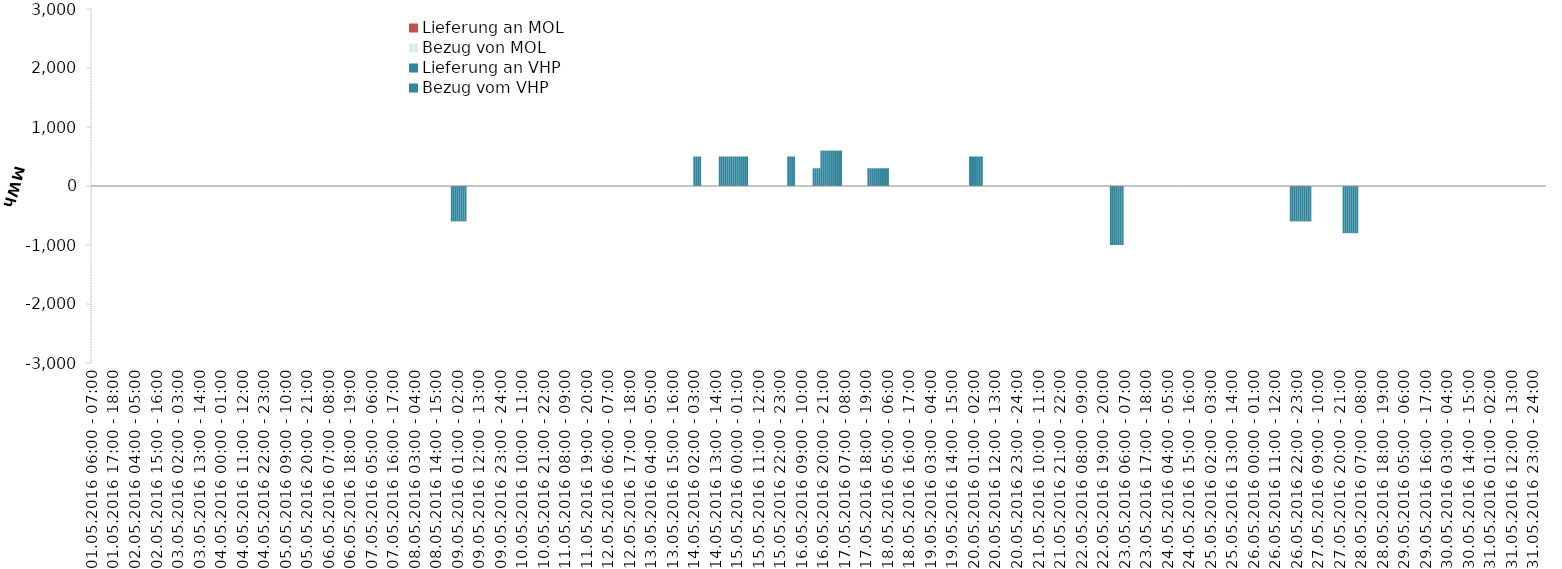
| Category | Bezug vom VHP | Lieferung an VHP | Bezug von MOL | Lieferung an MOL |
|---|---|---|---|---|
| 01.05.2016 06:00 - 07:00 | 0 | 0 | 0 | 0 |
| 01.05.2016 07:00 - 08:00 | 0 | 0 | 0 | 0 |
| 01.05.2016 08:00 - 09:00 | 0 | 0 | 0 | 0 |
| 01.05.2016 09:00 - 10:00 | 0 | 0 | 0 | 0 |
| 01.05.2016 10:00 - 11:00 | 0 | 0 | 0 | 0 |
| 01.05.2016 11:00 - 12:00 | 0 | 0 | 0 | 0 |
| 01.05.2016 12:00 - 13:00 | 0 | 0 | 0 | 0 |
| 01.05.2016 13:00 - 14:00 | 0 | 0 | 0 | 0 |
| 01.05.2016 14:00 - 15:00 | 0 | 0 | 0 | 0 |
| 01.05.2016 15:00 - 16:00 | 0 | 0 | 0 | 0 |
| 01.05.2016 16:00 - 17:00 | 0 | 0 | 0 | 0 |
| 01.05.2016 17:00 - 18:00 | 0 | 0 | 0 | 0 |
| 01.05.2016 18:00 - 19:00 | 0 | 0 | 0 | 0 |
| 01.05.2016 19:00 - 20:00 | 0 | 0 | 0 | 0 |
| 01.05.2016 20:00 - 21:00 | 0 | 0 | 0 | 0 |
| 01.05.2016 21:00 - 22:00 | 0 | 0 | 0 | 0 |
| 01.05.2016 22:00 - 23:00 | 0 | 0 | 0 | 0 |
| 01.05.2016 23:00 - 24:00 | 0 | 0 | 0 | 0 |
| 02.05.2016 00:00 - 01:00 | 0 | 0 | 0 | 0 |
| 02.05.2016 01:00 - 02:00 | 0 | 0 | 0 | 0 |
| 02.05.2016 02:00 - 03:00 | 0 | 0 | 0 | 0 |
| 02.05.2016 03:00 - 04:00 | 0 | 0 | 0 | 0 |
| 02.05.2016 04:00 - 05:00 | 0 | 0 | 0 | 0 |
| 02.05.2016 05:00 - 06:00 | 0 | 0 | 0 | 0 |
| 02.05.2016 06:00 - 07:00 | 0 | 0 | 0 | 0 |
| 02.05.2016 07:00 - 08:00 | 0 | 0 | 0 | 0 |
| 02.05.2016 08:00 - 09:00 | 0 | 0 | 0 | 0 |
| 02.05.2016 09:00 - 10:00 | 0 | 0 | 0 | 0 |
| 02.05.2016 10:00 - 11:00 | 0 | 0 | 0 | 0 |
| 02.05.2016 11:00 - 12:00 | 0 | 0 | 0 | 0 |
| 02.05.2016 12:00 - 13:00 | 0 | 0 | 0 | 0 |
| 02.05.2016 13:00 - 14:00 | 0 | 0 | 0 | 0 |
| 02.05.2016 14:00 - 15:00 | 0 | 0 | 0 | 0 |
| 02.05.2016 15:00 - 16:00 | 0 | 0 | 0 | 0 |
| 02.05.2016 16:00 - 17:00 | 0 | 0 | 0 | 0 |
| 02.05.2016 17:00 - 18:00 | 0 | 0 | 0 | 0 |
| 02.05.2016 18:00 - 19:00 | 0 | 0 | 0 | 0 |
| 02.05.2016 19:00 - 20:00 | 0 | 0 | 0 | 0 |
| 02.05.2016 20:00 - 21:00 | 0 | 0 | 0 | 0 |
| 02.05.2016 21:00 - 22:00 | 0 | 0 | 0 | 0 |
| 02.05.2016 22:00 - 23:00 | 0 | 0 | 0 | 0 |
| 02.05.2016 23:00 - 24:00 | 0 | 0 | 0 | 0 |
| 03.05.2016 00:00 - 01:00 | 0 | 0 | 0 | 0 |
| 03.05.2016 01:00 - 02:00 | 0 | 0 | 0 | 0 |
| 03.05.2016 02:00 - 03:00 | 0 | 0 | 0 | 0 |
| 03.05.2016 03:00 - 04:00 | 0 | 0 | 0 | 0 |
| 03.05.2016 04:00 - 05:00 | 0 | 0 | 0 | 0 |
| 03.05.2016 05:00 - 06:00 | 0 | 0 | 0 | 0 |
| 03.05.2016 06:00 - 07:00 | 0 | 0 | 0 | 0 |
| 03.05.2016 07:00 - 08:00 | 0 | 0 | 0 | 0 |
| 03.05.2016 08:00 - 09:00 | 0 | 0 | 0 | 0 |
| 03.05.2016 09:00 - 10:00 | 0 | 0 | 0 | 0 |
| 03.05.2016 10:00 - 11:00 | 0 | 0 | 0 | 0 |
| 03.05.2016 11:00 - 12:00 | 0 | 0 | 0 | 0 |
| 03.05.2016 12:00 - 13:00 | 0 | 0 | 0 | 0 |
| 03.05.2016 13:00 - 14:00 | 0 | 0 | 0 | 0 |
| 03.05.2016 14:00 - 15:00 | 0 | 0 | 0 | 0 |
| 03.05.2016 15:00 - 16:00 | 0 | 0 | 0 | 0 |
| 03.05.2016 16:00 - 17:00 | 0 | 0 | 0 | 0 |
| 03.05.2016 17:00 - 18:00 | 0 | 0 | 0 | 0 |
| 03.05.2016 18:00 - 19:00 | 0 | 0 | 0 | 0 |
| 03.05.2016 19:00 - 20:00 | 0 | 0 | 0 | 0 |
| 03.05.2016 20:00 - 21:00 | 0 | 0 | 0 | 0 |
| 03.05.2016 21:00 - 22:00 | 0 | 0 | 0 | 0 |
| 03.05.2016 22:00 - 23:00 | 0 | 0 | 0 | 0 |
| 03.05.2016 23:00 - 24:00 | 0 | 0 | 0 | 0 |
| 04.05.2016 00:00 - 01:00 | 0 | 0 | 0 | 0 |
| 04.05.2016 01:00 - 02:00 | 0 | 0 | 0 | 0 |
| 04.05.2016 02:00 - 03:00 | 0 | 0 | 0 | 0 |
| 04.05.2016 03:00 - 04:00 | 0 | 0 | 0 | 0 |
| 04.05.2016 04:00 - 05:00 | 0 | 0 | 0 | 0 |
| 04.05.2016 05:00 - 06:00 | 0 | 0 | 0 | 0 |
| 04.05.2016 06:00 - 07:00 | 0 | 0 | 0 | 0 |
| 04.05.2016 07:00 - 08:00 | 0 | 0 | 0 | 0 |
| 04.05.2016 08:00 - 09:00 | 0 | 0 | 0 | 0 |
| 04.05.2016 09:00 - 10:00 | 0 | 0 | 0 | 0 |
| 04.05.2016 10:00 - 11:00 | 0 | 0 | 0 | 0 |
| 04.05.2016 11:00 - 12:00 | 0 | 0 | 0 | 0 |
| 04.05.2016 12:00 - 13:00 | 0 | 0 | 0 | 0 |
| 04.05.2016 13:00 - 14:00 | 0 | 0 | 0 | 0 |
| 04.05.2016 14:00 - 15:00 | 0 | 0 | 0 | 0 |
| 04.05.2016 15:00 - 16:00 | 0 | 0 | 0 | 0 |
| 04.05.2016 16:00 - 17:00 | 0 | 0 | 0 | 0 |
| 04.05.2016 17:00 - 18:00 | 0 | 0 | 0 | 0 |
| 04.05.2016 18:00 - 19:00 | 0 | 0 | 0 | 0 |
| 04.05.2016 19:00 - 20:00 | 0 | 0 | 0 | 0 |
| 04.05.2016 20:00 - 21:00 | 0 | 0 | 0 | 0 |
| 04.05.2016 21:00 - 22:00 | 0 | 0 | 0 | 0 |
| 04.05.2016 22:00 - 23:00 | 0 | 0 | 0 | 0 |
| 04.05.2016 23:00 - 24:00 | 0 | 0 | 0 | 0 |
| 05.05.2016 00:00 - 01:00 | 0 | 0 | 0 | 0 |
| 05.05.2016 01:00 - 02:00 | 0 | 0 | 0 | 0 |
| 05.05.2016 02:00 - 03:00 | 0 | 0 | 0 | 0 |
| 05.05.2016 03:00 - 04:00 | 0 | 0 | 0 | 0 |
| 05.05.2016 04:00 - 05:00 | 0 | 0 | 0 | 0 |
| 05.05.2016 05:00 - 06:00 | 0 | 0 | 0 | 0 |
| 05.05.2016 06:00 - 07:00 | 0 | 0 | 0 | 0 |
| 05.05.2016 07:00 - 08:00 | 0 | 0 | 0 | 0 |
| 05.05.2016 08:00 - 09:00 | 0 | 0 | 0 | 0 |
| 05.05.2016 09:00 - 10:00 | 0 | 0 | 0 | 0 |
| 05.05.2016 10:00 - 11:00 | 0 | 0 | 0 | 0 |
| 05.05.2016 11:00 - 12:00 | 0 | 0 | 0 | 0 |
| 05.05.2016 12:00 - 13:00 | 0 | 0 | 0 | 0 |
| 05.05.2016 13:00 - 14:00 | 0 | 0 | 0 | 0 |
| 05.05.2016 14:00 - 15:00 | 0 | 0 | 0 | 0 |
| 05.05.2016 15:00 - 16:00 | 0 | 0 | 0 | 0 |
| 05.05.2016 16:00 - 17:00 | 0 | 0 | 0 | 0 |
| 05.05.2016 17:00 - 18:00 | 0 | 0 | 0 | 0 |
| 05.05.2016 18:00 - 19:00 | 0 | 0 | 0 | 0 |
| 05.05.2016 19:00 - 20:00 | 0 | 0 | 0 | 0 |
| 05.05.2016 20:00 - 21:00 | 0 | 0 | 0 | 0 |
| 05.05.2016 21:00 - 22:00 | 0 | 0 | 0 | 0 |
| 05.05.2016 22:00 - 23:00 | 0 | 0 | 0 | 0 |
| 05.05.2016 23:00 - 24:00 | 0 | 0 | 0 | 0 |
| 06.05.2016 00:00 - 01:00 | 0 | 0 | 0 | 0 |
| 06.05.2016 01:00 - 02:00 | 0 | 0 | 0 | 0 |
| 06.05.2016 02:00 - 03:00 | 0 | 0 | 0 | 0 |
| 06.05.2016 03:00 - 04:00 | 0 | 0 | 0 | 0 |
| 06.05.2016 04:00 - 05:00 | 0 | 0 | 0 | 0 |
| 06.05.2016 05:00 - 06:00 | 0 | 0 | 0 | 0 |
| 06.05.2016 06:00 - 07:00 | 0 | 0 | 0 | 0 |
| 06.05.2016 07:00 - 08:00 | 0 | 0 | 0 | 0 |
| 06.05.2016 08:00 - 09:00 | 0 | 0 | 0 | 0 |
| 06.05.2016 09:00 - 10:00 | 0 | 0 | 0 | 0 |
| 06.05.2016 10:00 - 11:00 | 0 | 0 | 0 | 0 |
| 06.05.2016 11:00 - 12:00 | 0 | 0 | 0 | 0 |
| 06.05.2016 12:00 - 13:00 | 0 | 0 | 0 | 0 |
| 06.05.2016 13:00 - 14:00 | 0 | 0 | 0 | 0 |
| 06.05.2016 14:00 - 15:00 | 0 | 0 | 0 | 0 |
| 06.05.2016 15:00 - 16:00 | 0 | 0 | 0 | 0 |
| 06.05.2016 16:00 - 17:00 | 0 | 0 | 0 | 0 |
| 06.05.2016 17:00 - 18:00 | 0 | 0 | 0 | 0 |
| 06.05.2016 18:00 - 19:00 | 0 | 0 | 0 | 0 |
| 06.05.2016 19:00 - 20:00 | 0 | 0 | 0 | 0 |
| 06.05.2016 20:00 - 21:00 | 0 | 0 | 0 | 0 |
| 06.05.2016 21:00 - 22:00 | 0 | 0 | 0 | 0 |
| 06.05.2016 22:00 - 23:00 | 0 | 0 | 0 | 0 |
| 06.05.2016 23:00 - 24:00 | 0 | 0 | 0 | 0 |
| 07.05.2016 00:00 - 01:00 | 0 | 0 | 0 | 0 |
| 07.05.2016 01:00 - 02:00 | 0 | 0 | 0 | 0 |
| 07.05.2016 02:00 - 03:00 | 0 | 0 | 0 | 0 |
| 07.05.2016 03:00 - 04:00 | 0 | 0 | 0 | 0 |
| 07.05.2016 04:00 - 05:00 | 0 | 0 | 0 | 0 |
| 07.05.2016 05:00 - 06:00 | 0 | 0 | 0 | 0 |
| 07.05.2016 06:00 - 07:00 | 0 | 0 | 0 | 0 |
| 07.05.2016 07:00 - 08:00 | 0 | 0 | 0 | 0 |
| 07.05.2016 08:00 - 09:00 | 0 | 0 | 0 | 0 |
| 07.05.2016 09:00 - 10:00 | 0 | 0 | 0 | 0 |
| 07.05.2016 10:00 - 11:00 | 0 | 0 | 0 | 0 |
| 07.05.2016 11:00 - 12:00 | 0 | 0 | 0 | 0 |
| 07.05.2016 12:00 - 13:00 | 0 | 0 | 0 | 0 |
| 07.05.2016 13:00 - 14:00 | 0 | 0 | 0 | 0 |
| 07.05.2016 14:00 - 15:00 | 0 | 0 | 0 | 0 |
| 07.05.2016 15:00 - 16:00 | 0 | 0 | 0 | 0 |
| 07.05.2016 16:00 - 17:00 | 0 | 0 | 0 | 0 |
| 07.05.2016 17:00 - 18:00 | 0 | 0 | 0 | 0 |
| 07.05.2016 18:00 - 19:00 | 0 | 0 | 0 | 0 |
| 07.05.2016 19:00 - 20:00 | 0 | 0 | 0 | 0 |
| 07.05.2016 20:00 - 21:00 | 0 | 0 | 0 | 0 |
| 07.05.2016 21:00 - 22:00 | 0 | 0 | 0 | 0 |
| 07.05.2016 22:00 - 23:00 | 0 | 0 | 0 | 0 |
| 07.05.2016 23:00 - 24:00 | 0 | 0 | 0 | 0 |
| 08.05.2016 00:00 - 01:00 | 0 | 0 | 0 | 0 |
| 08.05.2016 01:00 - 02:00 | 0 | 0 | 0 | 0 |
| 08.05.2016 02:00 - 03:00 | 0 | 0 | 0 | 0 |
| 08.05.2016 03:00 - 04:00 | 0 | 0 | 0 | 0 |
| 08.05.2016 04:00 - 05:00 | 0 | 0 | 0 | 0 |
| 08.05.2016 05:00 - 06:00 | 0 | 0 | 0 | 0 |
| 08.05.2016 06:00 - 07:00 | 0 | 0 | 0 | 0 |
| 08.05.2016 07:00 - 08:00 | 0 | 0 | 0 | 0 |
| 08.05.2016 08:00 - 09:00 | 0 | 0 | 0 | 0 |
| 08.05.2016 09:00 - 10:00 | 0 | 0 | 0 | 0 |
| 08.05.2016 10:00 - 11:00 | 0 | 0 | 0 | 0 |
| 08.05.2016 11:00 - 12:00 | 0 | 0 | 0 | 0 |
| 08.05.2016 12:00 - 13:00 | 0 | 0 | 0 | 0 |
| 08.05.2016 13:00 - 14:00 | 0 | 0 | 0 | 0 |
| 08.05.2016 14:00 - 15:00 | 0 | 0 | 0 | 0 |
| 08.05.2016 15:00 - 16:00 | 0 | 0 | 0 | 0 |
| 08.05.2016 16:00 - 17:00 | 0 | 0 | 0 | 0 |
| 08.05.2016 17:00 - 18:00 | 0 | 0 | 0 | 0 |
| 08.05.2016 18:00 - 19:00 | 0 | 0 | 0 | 0 |
| 08.05.2016 19:00 - 20:00 | 0 | 0 | 0 | 0 |
| 08.05.2016 20:00 - 21:00 | 0 | 0 | 0 | 0 |
| 08.05.2016 21:00 - 22:00 | 0 | 0 | 0 | 0 |
| 08.05.2016 22:00 - 23:00 | 0 | -600 | 0 | 0 |
| 08.05.2016 23:00 - 24:00 | 0 | -600 | 0 | 0 |
| 09.05.2016 00:00 - 01:00 | 0 | -600 | 0 | 0 |
| 09.05.2016 01:00 - 02:00 | 0 | -600 | 0 | 0 |
| 09.05.2016 02:00 - 03:00 | 0 | -600 | 0 | 0 |
| 09.05.2016 03:00 - 04:00 | 0 | -600 | 0 | 0 |
| 09.05.2016 04:00 - 05:00 | 0 | -600 | 0 | 0 |
| 09.05.2016 05:00 - 06:00 | 0 | -600 | 0 | 0 |
| 09.05.2016 06:00 - 07:00 | 0 | 0 | 0 | 0 |
| 09.05.2016 07:00 - 08:00 | 0 | 0 | 0 | 0 |
| 09.05.2016 08:00 - 09:00 | 0 | 0 | 0 | 0 |
| 09.05.2016 09:00 - 10:00 | 0 | 0 | 0 | 0 |
| 09.05.2016 10:00 - 11:00 | 0 | 0 | 0 | 0 |
| 09.05.2016 11:00 - 12:00 | 0 | 0 | 0 | 0 |
| 09.05.2016 12:00 - 13:00 | 0 | 0 | 0 | 0 |
| 09.05.2016 13:00 - 14:00 | 0 | 0 | 0 | 0 |
| 09.05.2016 14:00 - 15:00 | 0 | 0 | 0 | 0 |
| 09.05.2016 15:00 - 16:00 | 0 | 0 | 0 | 0 |
| 09.05.2016 16:00 - 17:00 | 0 | 0 | 0 | 0 |
| 09.05.2016 17:00 - 18:00 | 0 | 0 | 0 | 0 |
| 09.05.2016 18:00 - 19:00 | 0 | 0 | 0 | 0 |
| 09.05.2016 19:00 - 20:00 | 0 | 0 | 0 | 0 |
| 09.05.2016 20:00 - 21:00 | 0 | 0 | 0 | 0 |
| 09.05.2016 21:00 - 22:00 | 0 | 0 | 0 | 0 |
| 09.05.2016 22:00 - 23:00 | 0 | 0 | 0 | 0 |
| 09.05.2016 23:00 - 24:00 | 0 | 0 | 0 | 0 |
| 10.05.2016 00:00 - 01:00 | 0 | 0 | 0 | 0 |
| 10.05.2016 01:00 - 02:00 | 0 | 0 | 0 | 0 |
| 10.05.2016 02:00 - 03:00 | 0 | 0 | 0 | 0 |
| 10.05.2016 03:00 - 04:00 | 0 | 0 | 0 | 0 |
| 10.05.2016 04:00 - 05:00 | 0 | 0 | 0 | 0 |
| 10.05.2016 05:00 - 06:00 | 0 | 0 | 0 | 0 |
| 10.05.2016 06:00 - 07:00 | 0 | 0 | 0 | 0 |
| 10.05.2016 07:00 - 08:00 | 0 | 0 | 0 | 0 |
| 10.05.2016 08:00 - 09:00 | 0 | 0 | 0 | 0 |
| 10.05.2016 09:00 - 10:00 | 0 | 0 | 0 | 0 |
| 10.05.2016 10:00 - 11:00 | 0 | 0 | 0 | 0 |
| 10.05.2016 11:00 - 12:00 | 0 | 0 | 0 | 0 |
| 10.05.2016 12:00 - 13:00 | 0 | 0 | 0 | 0 |
| 10.05.2016 13:00 - 14:00 | 0 | 0 | 0 | 0 |
| 10.05.2016 14:00 - 15:00 | 0 | 0 | 0 | 0 |
| 10.05.2016 15:00 - 16:00 | 0 | 0 | 0 | 0 |
| 10.05.2016 16:00 - 17:00 | 0 | 0 | 0 | 0 |
| 10.05.2016 17:00 - 18:00 | 0 | 0 | 0 | 0 |
| 10.05.2016 18:00 - 19:00 | 0 | 0 | 0 | 0 |
| 10.05.2016 19:00 - 20:00 | 0 | 0 | 0 | 0 |
| 10.05.2016 20:00 - 21:00 | 0 | 0 | 0 | 0 |
| 10.05.2016 21:00 - 22:00 | 0 | 0 | 0 | 0 |
| 10.05.2016 22:00 - 23:00 | 0 | 0 | 0 | 0 |
| 10.05.2016 23:00 - 24:00 | 0 | 0 | 0 | 0 |
| 11.05.2016 00:00 - 01:00 | 0 | 0 | 0 | 0 |
| 11.05.2016 01:00 - 02:00 | 0 | 0 | 0 | 0 |
| 11.05.2016 02:00 - 03:00 | 0 | 0 | 0 | 0 |
| 11.05.2016 03:00 - 04:00 | 0 | 0 | 0 | 0 |
| 11.05.2016 04:00 - 05:00 | 0 | 0 | 0 | 0 |
| 11.05.2016 05:00 - 06:00 | 0 | 0 | 0 | 0 |
| 11.05.2016 06:00 - 07:00 | 0 | 0 | 0 | 0 |
| 11.05.2016 07:00 - 08:00 | 0 | 0 | 0 | 0 |
| 11.05.2016 08:00 - 09:00 | 0 | 0 | 0 | 0 |
| 11.05.2016 09:00 - 10:00 | 0 | 0 | 0 | 0 |
| 11.05.2016 10:00 - 11:00 | 0 | 0 | 0 | 0 |
| 11.05.2016 11:00 - 12:00 | 0 | 0 | 0 | 0 |
| 11.05.2016 12:00 - 13:00 | 0 | 0 | 0 | 0 |
| 11.05.2016 13:00 - 14:00 | 0 | 0 | 0 | 0 |
| 11.05.2016 14:00 - 15:00 | 0 | 0 | 0 | 0 |
| 11.05.2016 15:00 - 16:00 | 0 | 0 | 0 | 0 |
| 11.05.2016 16:00 - 17:00 | 0 | 0 | 0 | 0 |
| 11.05.2016 17:00 - 18:00 | 0 | 0 | 0 | 0 |
| 11.05.2016 18:00 - 19:00 | 0 | 0 | 0 | 0 |
| 11.05.2016 19:00 - 20:00 | 0 | 0 | 0 | 0 |
| 11.05.2016 20:00 - 21:00 | 0 | 0 | 0 | 0 |
| 11.05.2016 21:00 - 22:00 | 0 | 0 | 0 | 0 |
| 11.05.2016 22:00 - 23:00 | 0 | 0 | 0 | 0 |
| 11.05.2016 23:00 - 24:00 | 0 | 0 | 0 | 0 |
| 12.05.2016 00:00 - 01:00 | 0 | 0 | 0 | 0 |
| 12.05.2016 01:00 - 02:00 | 0 | 0 | 0 | 0 |
| 12.05.2016 02:00 - 03:00 | 0 | 0 | 0 | 0 |
| 12.05.2016 03:00 - 04:00 | 0 | 0 | 0 | 0 |
| 12.05.2016 04:00 - 05:00 | 0 | 0 | 0 | 0 |
| 12.05.2016 05:00 - 06:00 | 0 | 0 | 0 | 0 |
| 12.05.2016 06:00 - 07:00 | 0 | 0 | 0 | 0 |
| 12.05.2016 07:00 - 08:00 | 0 | 0 | 0 | 0 |
| 12.05.2016 08:00 - 09:00 | 0 | 0 | 0 | 0 |
| 12.05.2016 09:00 - 10:00 | 0 | 0 | 0 | 0 |
| 12.05.2016 10:00 - 11:00 | 0 | 0 | 0 | 0 |
| 12.05.2016 11:00 - 12:00 | 0 | 0 | 0 | 0 |
| 12.05.2016 12:00 - 13:00 | 0 | 0 | 0 | 0 |
| 12.05.2016 13:00 - 14:00 | 0 | 0 | 0 | 0 |
| 12.05.2016 14:00 - 15:00 | 0 | 0 | 0 | 0 |
| 12.05.2016 15:00 - 16:00 | 0 | 0 | 0 | 0 |
| 12.05.2016 16:00 - 17:00 | 0 | 0 | 0 | 0 |
| 12.05.2016 17:00 - 18:00 | 0 | 0 | 0 | 0 |
| 12.05.2016 18:00 - 19:00 | 0 | 0 | 0 | 0 |
| 12.05.2016 19:00 - 20:00 | 0 | 0 | 0 | 0 |
| 12.05.2016 20:00 - 21:00 | 0 | 0 | 0 | 0 |
| 12.05.2016 21:00 - 22:00 | 0 | 0 | 0 | 0 |
| 12.05.2016 22:00 - 23:00 | 0 | 0 | 0 | 0 |
| 12.05.2016 23:00 - 24:00 | 0 | 0 | 0 | 0 |
| 13.05.2016 00:00 - 01:00 | 0 | 0 | 0 | 0 |
| 13.05.2016 01:00 - 02:00 | 0 | 0 | 0 | 0 |
| 13.05.2016 02:00 - 03:00 | 0 | 0 | 0 | 0 |
| 13.05.2016 03:00 - 04:00 | 0 | 0 | 0 | 0 |
| 13.05.2016 04:00 - 05:00 | 0 | 0 | 0 | 0 |
| 13.05.2016 05:00 - 06:00 | 0 | 0 | 0 | 0 |
| 13.05.2016 06:00 - 07:00 | 0 | 0 | 0 | 0 |
| 13.05.2016 07:00 - 08:00 | 0 | 0 | 0 | 0 |
| 13.05.2016 08:00 - 09:00 | 0 | 0 | 0 | 0 |
| 13.05.2016 09:00 - 10:00 | 0 | 0 | 0 | 0 |
| 13.05.2016 10:00 - 11:00 | 0 | 0 | 0 | 0 |
| 13.05.2016 11:00 - 12:00 | 0 | 0 | 0 | 0 |
| 13.05.2016 12:00 - 13:00 | 0 | 0 | 0 | 0 |
| 13.05.2016 13:00 - 14:00 | 0 | 0 | 0 | 0 |
| 13.05.2016 14:00 - 15:00 | 0 | 0 | 0 | 0 |
| 13.05.2016 15:00 - 16:00 | 0 | 0 | 0 | 0 |
| 13.05.2016 16:00 - 17:00 | 0 | 0 | 0 | 0 |
| 13.05.2016 17:00 - 18:00 | 0 | 0 | 0 | 0 |
| 13.05.2016 18:00 - 19:00 | 0 | 0 | 0 | 0 |
| 13.05.2016 19:00 - 20:00 | 0 | 0 | 0 | 0 |
| 13.05.2016 20:00 - 21:00 | 0 | 0 | 0 | 0 |
| 13.05.2016 21:00 - 22:00 | 0 | 0 | 0 | 0 |
| 13.05.2016 22:00 - 23:00 | 0 | 0 | 0 | 0 |
| 13.05.2016 23:00 - 24:00 | 0 | 0 | 0 | 0 |
| 14.05.2016 00:00 - 01:00 | 0 | 0 | 0 | 0 |
| 14.05.2016 01:00 - 02:00 | 0 | 0 | 0 | 0 |
| 14.05.2016 02:00 - 03:00 | 500 | 0 | 0 | 0 |
| 14.05.2016 03:00 - 04:00 | 500 | 0 | 0 | 0 |
| 14.05.2016 04:00 - 05:00 | 500 | 0 | 0 | 0 |
| 14.05.2016 05:00 - 06:00 | 500 | 0 | 0 | 0 |
| 14.05.2016 06:00 - 07:00 | 0 | 0 | 0 | 0 |
| 14.05.2016 07:00 - 08:00 | 0 | 0 | 0 | 0 |
| 14.05.2016 08:00 - 09:00 | 0 | 0 | 0 | 0 |
| 14.05.2016 09:00 - 10:00 | 0 | 0 | 0 | 0 |
| 14.05.2016 10:00 - 11:00 | 0 | 0 | 0 | 0 |
| 14.05.2016 11:00 - 12:00 | 0 | 0 | 0 | 0 |
| 14.05.2016 12:00 - 13:00 | 0 | 0 | 0 | 0 |
| 14.05.2016 13:00 - 14:00 | 0 | 0 | 0 | 0 |
| 14.05.2016 14:00 - 15:00 | 0 | 0 | 0 | 0 |
| 14.05.2016 15:00 - 16:00 | 500 | 0 | 0 | 0 |
| 14.05.2016 16:00 - 17:00 | 500 | 0 | 0 | 0 |
| 14.05.2016 17:00 - 18:00 | 500 | 0 | 0 | 0 |
| 14.05.2016 18:00 - 19:00 | 500 | 0 | 0 | 0 |
| 14.05.2016 19:00 - 20:00 | 500 | 0 | 0 | 0 |
| 14.05.2016 20:00 - 21:00 | 500 | 0 | 0 | 0 |
| 14.05.2016 21:00 - 22:00 | 500 | 0 | 0 | 0 |
| 14.05.2016 22:00 - 23:00 | 500 | 0 | 0 | 0 |
| 14.05.2016 23:00 - 24:00 | 500 | 0 | 0 | 0 |
| 15.05.2016 00:00 - 01:00 | 500 | 0 | 0 | 0 |
| 15.05.2016 01:00 - 02:00 | 500 | 0 | 0 | 0 |
| 15.05.2016 02:00 - 03:00 | 500 | 0 | 0 | 0 |
| 15.05.2016 03:00 - 04:00 | 500 | 0 | 0 | 0 |
| 15.05.2016 04:00 - 05:00 | 500 | 0 | 0 | 0 |
| 15.05.2016 05:00 - 06:00 | 500 | 0 | 0 | 0 |
| 15.05.2016 06:00 - 07:00 | 0 | 0 | 0 | 0 |
| 15.05.2016 07:00 - 08:00 | 0 | 0 | 0 | 0 |
| 15.05.2016 08:00 - 09:00 | 0 | 0 | 0 | 0 |
| 15.05.2016 09:00 - 10:00 | 0 | 0 | 0 | 0 |
| 15.05.2016 10:00 - 11:00 | 0 | 0 | 0 | 0 |
| 15.05.2016 11:00 - 12:00 | 0 | 0 | 0 | 0 |
| 15.05.2016 12:00 - 13:00 | 0 | 0 | 0 | 0 |
| 15.05.2016 13:00 - 14:00 | 0 | 0 | 0 | 0 |
| 15.05.2016 14:00 - 15:00 | 0 | 0 | 0 | 0 |
| 15.05.2016 15:00 - 16:00 | 0 | 0 | 0 | 0 |
| 15.05.2016 16:00 - 17:00 | 0 | 0 | 0 | 0 |
| 15.05.2016 17:00 - 18:00 | 0 | 0 | 0 | 0 |
| 15.05.2016 18:00 - 19:00 | 0 | 0 | 0 | 0 |
| 15.05.2016 19:00 - 20:00 | 0 | 0 | 0 | 0 |
| 15.05.2016 20:00 - 21:00 | 0 | 0 | 0 | 0 |
| 15.05.2016 21:00 - 22:00 | 0 | 0 | 0 | 0 |
| 15.05.2016 22:00 - 23:00 | 0 | 0 | 0 | 0 |
| 15.05.2016 23:00 - 24:00 | 0 | 0 | 0 | 0 |
| 16.05.2016 00:00 - 01:00 | 0 | 0 | 0 | 0 |
| 16.05.2016 01:00 - 02:00 | 0 | 0 | 0 | 0 |
| 16.05.2016 02:00 - 03:00 | 500 | 0 | 0 | 0 |
| 16.05.2016 03:00 - 04:00 | 500 | 0 | 0 | 0 |
| 16.05.2016 04:00 - 05:00 | 500 | 0 | 0 | 0 |
| 16.05.2016 05:00 - 06:00 | 500 | 0 | 0 | 0 |
| 16.05.2016 06:00 - 07:00 | 0 | 0 | 0 | 0 |
| 16.05.2016 07:00 - 08:00 | 0 | 0 | 0 | 0 |
| 16.05.2016 08:00 - 09:00 | 0 | 0 | 0 | 0 |
| 16.05.2016 09:00 - 10:00 | 0 | 0 | 0 | 0 |
| 16.05.2016 10:00 - 11:00 | 0 | 0 | 0 | 0 |
| 16.05.2016 11:00 - 12:00 | 0 | 0 | 0 | 0 |
| 16.05.2016 12:00 - 13:00 | 0 | 0 | 0 | 0 |
| 16.05.2016 13:00 - 14:00 | 0 | 0 | 0 | 0 |
| 16.05.2016 14:00 - 15:00 | 0 | 0 | 0 | 0 |
| 16.05.2016 15:00 - 16:00 | 300 | 0 | 0 | 0 |
| 16.05.2016 16:00 - 17:00 | 300 | 0 | 0 | 0 |
| 16.05.2016 17:00 - 18:00 | 300 | 0 | 0 | 0 |
| 16.05.2016 18:00 - 19:00 | 300 | 0 | 0 | 0 |
| 16.05.2016 19:00 - 20:00 | 600 | 0 | 0 | 0 |
| 16.05.2016 20:00 - 21:00 | 600 | 0 | 0 | 0 |
| 16.05.2016 21:00 - 22:00 | 600 | 0 | 0 | 0 |
| 16.05.2016 22:00 - 23:00 | 600 | 0 | 0 | 0 |
| 16.05.2016 23:00 - 24:00 | 600 | 0 | 0 | 0 |
| 17.05.2016 00:00 - 01:00 | 600 | 0 | 0 | 0 |
| 17.05.2016 01:00 - 02:00 | 600 | 0 | 0 | 0 |
| 17.05.2016 02:00 - 03:00 | 600 | 0 | 0 | 0 |
| 17.05.2016 03:00 - 04:00 | 600 | 0 | 0 | 0 |
| 17.05.2016 04:00 - 05:00 | 600 | 0 | 0 | 0 |
| 17.05.2016 05:00 - 06:00 | 600 | 0 | 0 | 0 |
| 17.05.2016 06:00 - 07:00 | 0 | 0 | 0 | 0 |
| 17.05.2016 07:00 - 08:00 | 0 | 0 | 0 | 0 |
| 17.05.2016 08:00 - 09:00 | 0 | 0 | 0 | 0 |
| 17.05.2016 09:00 - 10:00 | 0 | 0 | 0 | 0 |
| 17.05.2016 10:00 - 11:00 | 0 | 0 | 0 | 0 |
| 17.05.2016 11:00 - 12:00 | 0 | 0 | 0 | 0 |
| 17.05.2016 12:00 - 13:00 | 0 | 0 | 0 | 0 |
| 17.05.2016 13:00 - 14:00 | 0 | 0 | 0 | 0 |
| 17.05.2016 14:00 - 15:00 | 0 | 0 | 0 | 0 |
| 17.05.2016 15:00 - 16:00 | 0 | 0 | 0 | 0 |
| 17.05.2016 16:00 - 17:00 | 0 | 0 | 0 | 0 |
| 17.05.2016 17:00 - 18:00 | 0 | 0 | 0 | 0 |
| 17.05.2016 18:00 - 19:00 | 0 | 0 | 0 | 0 |
| 17.05.2016 19:00 - 20:00 | 300 | 0 | 0 | 0 |
| 17.05.2016 20:00 - 21:00 | 300 | 0 | 0 | 0 |
| 17.05.2016 21:00 - 22:00 | 300 | 0 | 0 | 0 |
| 17.05.2016 22:00 - 23:00 | 300 | 0 | 0 | 0 |
| 17.05.2016 23:00 - 24:00 | 300 | 0 | 0 | 0 |
| 18.05.2016 00:00 - 01:00 | 300 | 0 | 0 | 0 |
| 18.05.2016 01:00 - 02:00 | 300 | 0 | 0 | 0 |
| 18.05.2016 02:00 - 03:00 | 300 | 0 | 0 | 0 |
| 18.05.2016 03:00 - 04:00 | 300 | 0 | 0 | 0 |
| 18.05.2016 04:00 - 05:00 | 300 | 0 | 0 | 0 |
| 18.05.2016 05:00 - 06:00 | 300 | 0 | 0 | 0 |
| 18.05.2016 06:00 - 07:00 | 0 | 0 | 0 | 0 |
| 18.05.2016 07:00 - 08:00 | 0 | 0 | 0 | 0 |
| 18.05.2016 08:00 - 09:00 | 0 | 0 | 0 | 0 |
| 18.05.2016 09:00 - 10:00 | 0 | 0 | 0 | 0 |
| 18.05.2016 10:00 - 11:00 | 0 | 0 | 0 | 0 |
| 18.05.2016 11:00 - 12:00 | 0 | 0 | 0 | 0 |
| 18.05.2016 12:00 - 13:00 | 0 | 0 | 0 | 0 |
| 18.05.2016 13:00 - 14:00 | 0 | 0 | 0 | 0 |
| 18.05.2016 14:00 - 15:00 | 0 | 0 | 0 | 0 |
| 18.05.2016 15:00 - 16:00 | 0 | 0 | 0 | 0 |
| 18.05.2016 16:00 - 17:00 | 0 | 0 | 0 | 0 |
| 18.05.2016 17:00 - 18:00 | 0 | 0 | 0 | 0 |
| 18.05.2016 18:00 - 19:00 | 0 | 0 | 0 | 0 |
| 18.05.2016 19:00 - 20:00 | 0 | 0 | 0 | 0 |
| 18.05.2016 20:00 - 21:00 | 0 | 0 | 0 | 0 |
| 18.05.2016 21:00 - 22:00 | 0 | 0 | 0 | 0 |
| 18.05.2016 22:00 - 23:00 | 0 | 0 | 0 | 0 |
| 18.05.2016 23:00 - 24:00 | 0 | 0 | 0 | 0 |
| 19.05.2016 00:00 - 01:00 | 0 | 0 | 0 | 0 |
| 19.05.2016 01:00 - 02:00 | 0 | 0 | 0 | 0 |
| 19.05.2016 02:00 - 03:00 | 0 | 0 | 0 | 0 |
| 19.05.2016 03:00 - 04:00 | 0 | 0 | 0 | 0 |
| 19.05.2016 04:00 - 05:00 | 0 | 0 | 0 | 0 |
| 19.05.2016 05:00 - 06:00 | 0 | 0 | 0 | 0 |
| 19.05.2016 06:00 - 07:00 | 0 | 0 | 0 | 0 |
| 19.05.2016 07:00 - 08:00 | 0 | 0 | 0 | 0 |
| 19.05.2016 08:00 - 09:00 | 0 | 0 | 0 | 0 |
| 19.05.2016 09:00 - 10:00 | 0 | 0 | 0 | 0 |
| 19.05.2016 10:00 - 11:00 | 0 | 0 | 0 | 0 |
| 19.05.2016 11:00 - 12:00 | 0 | 0 | 0 | 0 |
| 19.05.2016 12:00 - 13:00 | 0 | 0 | 0 | 0 |
| 19.05.2016 13:00 - 14:00 | 0 | 0 | 0 | 0 |
| 19.05.2016 14:00 - 15:00 | 0 | 0 | 0 | 0 |
| 19.05.2016 15:00 - 16:00 | 0 | 0 | 0 | 0 |
| 19.05.2016 16:00 - 17:00 | 0 | 0 | 0 | 0 |
| 19.05.2016 17:00 - 18:00 | 0 | 0 | 0 | 0 |
| 19.05.2016 18:00 - 19:00 | 0 | 0 | 0 | 0 |
| 19.05.2016 19:00 - 20:00 | 0 | 0 | 0 | 0 |
| 19.05.2016 20:00 - 21:00 | 0 | 0 | 0 | 0 |
| 19.05.2016 21:00 - 22:00 | 0 | 0 | 0 | 0 |
| 19.05.2016 22:00 - 23:00 | 0 | 0 | 0 | 0 |
| 19.05.2016 23:00 - 24:00 | 500 | 0 | 0 | 0 |
| 20.05.2016 00:00 - 01:00 | 500 | 0 | 0 | 0 |
| 20.05.2016 01:00 - 02:00 | 500 | 0 | 0 | 0 |
| 20.05.2016 02:00 - 03:00 | 500 | 0 | 0 | 0 |
| 20.05.2016 03:00 - 04:00 | 500 | 0 | 0 | 0 |
| 20.05.2016 04:00 - 05:00 | 500 | 0 | 0 | 0 |
| 20.05.2016 05:00 - 06:00 | 500 | 0 | 0 | 0 |
| 20.05.2016 06:00 - 07:00 | 0 | 0 | 0 | 0 |
| 20.05.2016 07:00 - 08:00 | 0 | 0 | 0 | 0 |
| 20.05.2016 08:00 - 09:00 | 0 | 0 | 0 | 0 |
| 20.05.2016 09:00 - 10:00 | 0 | 0 | 0 | 0 |
| 20.05.2016 10:00 - 11:00 | 0 | 0 | 0 | 0 |
| 20.05.2016 11:00 - 12:00 | 0 | 0 | 0 | 0 |
| 20.05.2016 12:00 - 13:00 | 0 | 0 | 0 | 0 |
| 20.05.2016 13:00 - 14:00 | 0 | 0 | 0 | 0 |
| 20.05.2016 14:00 - 15:00 | 0 | 0 | 0 | 0 |
| 20.05.2016 15:00 - 16:00 | 0 | 0 | 0 | 0 |
| 20.05.2016 16:00 - 17:00 | 0 | 0 | 0 | 0 |
| 20.05.2016 17:00 - 18:00 | 0 | 0 | 0 | 0 |
| 20.05.2016 18:00 - 19:00 | 0 | 0 | 0 | 0 |
| 20.05.2016 19:00 - 20:00 | 0 | 0 | 0 | 0 |
| 20.05.2016 20:00 - 21:00 | 0 | 0 | 0 | 0 |
| 20.05.2016 21:00 - 22:00 | 0 | 0 | 0 | 0 |
| 20.05.2016 22:00 - 23:00 | 0 | 0 | 0 | 0 |
| 20.05.2016 23:00 - 24:00 | 0 | 0 | 0 | 0 |
| 21.05.2016 00:00 - 01:00 | 0 | 0 | 0 | 0 |
| 21.05.2016 01:00 - 02:00 | 0 | 0 | 0 | 0 |
| 21.05.2016 02:00 - 03:00 | 0 | 0 | 0 | 0 |
| 21.05.2016 03:00 - 04:00 | 0 | 0 | 0 | 0 |
| 21.05.2016 04:00 - 05:00 | 0 | 0 | 0 | 0 |
| 21.05.2016 05:00 - 06:00 | 0 | 0 | 0 | 0 |
| 21.05.2016 06:00 - 07:00 | 0 | 0 | 0 | 0 |
| 21.05.2016 07:00 - 08:00 | 0 | 0 | 0 | 0 |
| 21.05.2016 08:00 - 09:00 | 0 | 0 | 0 | 0 |
| 21.05.2016 09:00 - 10:00 | 0 | 0 | 0 | 0 |
| 21.05.2016 10:00 - 11:00 | 0 | 0 | 0 | 0 |
| 21.05.2016 11:00 - 12:00 | 0 | 0 | 0 | 0 |
| 21.05.2016 12:00 - 13:00 | 0 | 0 | 0 | 0 |
| 21.05.2016 13:00 - 14:00 | 0 | 0 | 0 | 0 |
| 21.05.2016 14:00 - 15:00 | 0 | 0 | 0 | 0 |
| 21.05.2016 15:00 - 16:00 | 0 | 0 | 0 | 0 |
| 21.05.2016 16:00 - 17:00 | 0 | 0 | 0 | 0 |
| 21.05.2016 17:00 - 18:00 | 0 | 0 | 0 | 0 |
| 21.05.2016 18:00 - 19:00 | 0 | 0 | 0 | 0 |
| 21.05.2016 19:00 - 20:00 | 0 | 0 | 0 | 0 |
| 21.05.2016 20:00 - 21:00 | 0 | 0 | 0 | 0 |
| 21.05.2016 21:00 - 22:00 | 0 | 0 | 0 | 0 |
| 21.05.2016 22:00 - 23:00 | 0 | 0 | 0 | 0 |
| 21.05.2016 23:00 - 24:00 | 0 | 0 | 0 | 0 |
| 22.05.2016 00:00 - 01:00 | 0 | 0 | 0 | 0 |
| 22.05.2016 01:00 - 02:00 | 0 | 0 | 0 | 0 |
| 22.05.2016 02:00 - 03:00 | 0 | 0 | 0 | 0 |
| 22.05.2016 03:00 - 04:00 | 0 | 0 | 0 | 0 |
| 22.05.2016 04:00 - 05:00 | 0 | 0 | 0 | 0 |
| 22.05.2016 05:00 - 06:00 | 0 | 0 | 0 | 0 |
| 22.05.2016 06:00 - 07:00 | 0 | 0 | 0 | 0 |
| 22.05.2016 07:00 - 08:00 | 0 | 0 | 0 | 0 |
| 22.05.2016 08:00 - 09:00 | 0 | 0 | 0 | 0 |
| 22.05.2016 09:00 - 10:00 | 0 | 0 | 0 | 0 |
| 22.05.2016 10:00 - 11:00 | 0 | 0 | 0 | 0 |
| 22.05.2016 11:00 - 12:00 | 0 | 0 | 0 | 0 |
| 22.05.2016 12:00 - 13:00 | 0 | 0 | 0 | 0 |
| 22.05.2016 13:00 - 14:00 | 0 | 0 | 0 | 0 |
| 22.05.2016 14:00 - 15:00 | 0 | 0 | 0 | 0 |
| 22.05.2016 15:00 - 16:00 | 0 | 0 | 0 | 0 |
| 22.05.2016 16:00 - 17:00 | 0 | 0 | 0 | 0 |
| 22.05.2016 17:00 - 18:00 | 0 | 0 | 0 | 0 |
| 22.05.2016 18:00 - 19:00 | 0 | 0 | 0 | 0 |
| 22.05.2016 19:00 - 20:00 | 0 | 0 | 0 | 0 |
| 22.05.2016 20:00 - 21:00 | 0 | 0 | 0 | 0 |
| 22.05.2016 21:00 - 22:00 | 0 | 0 | 0 | 0 |
| 22.05.2016 22:00 - 23:00 | 0 | 0 | 0 | 0 |
| 22.05.2016 23:00 - 24:00 | 0 | -1000 | 0 | 0 |
| 23.05.2016 00:00 - 01:00 | 0 | -1000 | 0 | 0 |
| 23.05.2016 01:00 - 02:00 | 0 | -1000 | 0 | 0 |
| 23.05.2016 02:00 - 03:00 | 0 | -1000 | 0 | 0 |
| 23.05.2016 03:00 - 04:00 | 0 | -1000 | 0 | 0 |
| 23.05.2016 04:00 - 05:00 | 0 | -1000 | 0 | 0 |
| 23.05.2016 05:00 - 06:00 | 0 | -1000 | 0 | 0 |
| 23.05.2016 06:00 - 07:00 | 0 | 0 | 0 | 0 |
| 23.05.2016 07:00 - 08:00 | 0 | 0 | 0 | 0 |
| 23.05.2016 08:00 - 09:00 | 0 | 0 | 0 | 0 |
| 23.05.2016 09:00 - 10:00 | 0 | 0 | 0 | 0 |
| 23.05.2016 10:00 - 11:00 | 0 | 0 | 0 | 0 |
| 23.05.2016 11:00 - 12:00 | 0 | 0 | 0 | 0 |
| 23.05.2016 12:00 - 13:00 | 0 | 0 | 0 | 0 |
| 23.05.2016 13:00 - 14:00 | 0 | 0 | 0 | 0 |
| 23.05.2016 14:00 - 15:00 | 0 | 0 | 0 | 0 |
| 23.05.2016 15:00 - 16:00 | 0 | 0 | 0 | 0 |
| 23.05.2016 16:00 - 17:00 | 0 | 0 | 0 | 0 |
| 23.05.2016 17:00 - 18:00 | 0 | 0 | 0 | 0 |
| 23.05.2016 18:00 - 19:00 | 0 | 0 | 0 | 0 |
| 23.05.2016 19:00 - 20:00 | 0 | 0 | 0 | 0 |
| 23.05.2016 20:00 - 21:00 | 0 | 0 | 0 | 0 |
| 23.05.2016 21:00 - 22:00 | 0 | 0 | 0 | 0 |
| 23.05.2016 22:00 - 23:00 | 0 | 0 | 0 | 0 |
| 23.05.2016 23:00 - 24:00 | 0 | 0 | 0 | 0 |
| 24.05.2016 00:00 - 01:00 | 0 | 0 | 0 | 0 |
| 24.05.2016 01:00 - 02:00 | 0 | 0 | 0 | 0 |
| 24.05.2016 02:00 - 03:00 | 0 | 0 | 0 | 0 |
| 24.05.2016 03:00 - 04:00 | 0 | 0 | 0 | 0 |
| 24.05.2016 04:00 - 05:00 | 0 | 0 | 0 | 0 |
| 24.05.2016 05:00 - 06:00 | 0 | 0 | 0 | 0 |
| 24.05.2016 06:00 - 07:00 | 0 | 0 | 0 | 0 |
| 24.05.2016 07:00 - 08:00 | 0 | 0 | 0 | 0 |
| 24.05.2016 08:00 - 09:00 | 0 | 0 | 0 | 0 |
| 24.05.2016 09:00 - 10:00 | 0 | 0 | 0 | 0 |
| 24.05.2016 10:00 - 11:00 | 0 | 0 | 0 | 0 |
| 24.05.2016 11:00 - 12:00 | 0 | 0 | 0 | 0 |
| 24.05.2016 12:00 - 13:00 | 0 | 0 | 0 | 0 |
| 24.05.2016 13:00 - 14:00 | 0 | 0 | 0 | 0 |
| 24.05.2016 14:00 - 15:00 | 0 | 0 | 0 | 0 |
| 24.05.2016 15:00 - 16:00 | 0 | 0 | 0 | 0 |
| 24.05.2016 16:00 - 17:00 | 0 | 0 | 0 | 0 |
| 24.05.2016 17:00 - 18:00 | 0 | 0 | 0 | 0 |
| 24.05.2016 18:00 - 19:00 | 0 | 0 | 0 | 0 |
| 24.05.2016 19:00 - 20:00 | 0 | 0 | 0 | 0 |
| 24.05.2016 20:00 - 21:00 | 0 | 0 | 0 | 0 |
| 24.05.2016 21:00 - 22:00 | 0 | 0 | 0 | 0 |
| 24.05.2016 22:00 - 23:00 | 0 | 0 | 0 | 0 |
| 24.05.2016 23:00 - 24:00 | 0 | 0 | 0 | 0 |
| 25.05.2016 00:00 - 01:00 | 0 | 0 | 0 | 0 |
| 25.05.2016 01:00 - 02:00 | 0 | 0 | 0 | 0 |
| 25.05.2016 02:00 - 03:00 | 0 | 0 | 0 | 0 |
| 25.05.2016 03:00 - 04:00 | 0 | 0 | 0 | 0 |
| 25.05.2016 04:00 - 05:00 | 0 | 0 | 0 | 0 |
| 25.05.2016 05:00 - 06:00 | 0 | 0 | 0 | 0 |
| 25.05.2016 06:00 - 07:00 | 0 | 0 | 0 | 0 |
| 25.05.2016 07:00 - 08:00 | 0 | 0 | 0 | 0 |
| 25.05.2016 08:00 - 09:00 | 0 | 0 | 0 | 0 |
| 25.05.2016 09:00 - 10:00 | 0 | 0 | 0 | 0 |
| 25.05.2016 10:00 - 11:00 | 0 | 0 | 0 | 0 |
| 25.05.2016 11:00 - 12:00 | 0 | 0 | 0 | 0 |
| 25.05.2016 12:00 - 13:00 | 0 | 0 | 0 | 0 |
| 25.05.2016 13:00 - 14:00 | 0 | 0 | 0 | 0 |
| 25.05.2016 14:00 - 15:00 | 0 | 0 | 0 | 0 |
| 25.05.2016 15:00 - 16:00 | 0 | 0 | 0 | 0 |
| 25.05.2016 16:00 - 17:00 | 0 | 0 | 0 | 0 |
| 25.05.2016 17:00 - 18:00 | 0 | 0 | 0 | 0 |
| 25.05.2016 18:00 - 19:00 | 0 | 0 | 0 | 0 |
| 25.05.2016 19:00 - 20:00 | 0 | 0 | 0 | 0 |
| 25.05.2016 20:00 - 21:00 | 0 | 0 | 0 | 0 |
| 25.05.2016 21:00 - 22:00 | 0 | 0 | 0 | 0 |
| 25.05.2016 22:00 - 23:00 | 0 | 0 | 0 | 0 |
| 25.05.2016 23:00 - 24:00 | 0 | 0 | 0 | 0 |
| 26.05.2016 00:00 - 01:00 | 0 | 0 | 0 | 0 |
| 26.05.2016 01:00 - 02:00 | 0 | 0 | 0 | 0 |
| 26.05.2016 02:00 - 03:00 | 0 | 0 | 0 | 0 |
| 26.05.2016 03:00 - 04:00 | 0 | 0 | 0 | 0 |
| 26.05.2016 04:00 - 05:00 | 0 | 0 | 0 | 0 |
| 26.05.2016 05:00 - 06:00 | 0 | 0 | 0 | 0 |
| 26.05.2016 06:00 - 07:00 | 0 | 0 | 0 | 0 |
| 26.05.2016 07:00 - 08:00 | 0 | 0 | 0 | 0 |
| 26.05.2016 08:00 - 09:00 | 0 | 0 | 0 | 0 |
| 26.05.2016 09:00 - 10:00 | 0 | 0 | 0 | 0 |
| 26.05.2016 10:00 - 11:00 | 0 | 0 | 0 | 0 |
| 26.05.2016 11:00 - 12:00 | 0 | 0 | 0 | 0 |
| 26.05.2016 12:00 - 13:00 | 0 | 0 | 0 | 0 |
| 26.05.2016 13:00 - 14:00 | 0 | 0 | 0 | 0 |
| 26.05.2016 14:00 - 15:00 | 0 | 0 | 0 | 0 |
| 26.05.2016 15:00 - 16:00 | 0 | 0 | 0 | 0 |
| 26.05.2016 16:00 - 17:00 | 0 | 0 | 0 | 0 |
| 26.05.2016 17:00 - 18:00 | 0 | 0 | 0 | 0 |
| 26.05.2016 18:00 - 19:00 | 0 | 0 | 0 | 0 |
| 26.05.2016 19:00 - 20:00 | 0 | -600 | 0 | 0 |
| 26.05.2016 20:00 - 21:00 | 0 | -600 | 0 | 0 |
| 26.05.2016 21:00 - 22:00 | 0 | -600 | 0 | 0 |
| 26.05.2016 22:00 - 23:00 | 0 | -600 | 0 | 0 |
| 26.05.2016 23:00 - 24:00 | 0 | -600 | 0 | 0 |
| 27.05.2016 00:00 - 01:00 | 0 | -600 | 0 | 0 |
| 27.05.2016 01:00 - 02:00 | 0 | -600 | 0 | 0 |
| 27.05.2016 02:00 - 03:00 | 0 | -600 | 0 | 0 |
| 27.05.2016 03:00 - 04:00 | 0 | -600 | 0 | 0 |
| 27.05.2016 04:00 - 05:00 | 0 | -600 | 0 | 0 |
| 27.05.2016 05:00 - 06:00 | 0 | -600 | 0 | 0 |
| 27.05.2016 06:00 - 07:00 | 0 | 0 | 0 | 0 |
| 27.05.2016 07:00 - 08:00 | 0 | 0 | 0 | 0 |
| 27.05.2016 08:00 - 09:00 | 0 | 0 | 0 | 0 |
| 27.05.2016 09:00 - 10:00 | 0 | 0 | 0 | 0 |
| 27.05.2016 10:00 - 11:00 | 0 | 0 | 0 | 0 |
| 27.05.2016 11:00 - 12:00 | 0 | 0 | 0 | 0 |
| 27.05.2016 12:00 - 13:00 | 0 | 0 | 0 | 0 |
| 27.05.2016 13:00 - 14:00 | 0 | 0 | 0 | 0 |
| 27.05.2016 14:00 - 15:00 | 0 | 0 | 0 | 0 |
| 27.05.2016 15:00 - 16:00 | 0 | 0 | 0 | 0 |
| 27.05.2016 16:00 - 17:00 | 0 | 0 | 0 | 0 |
| 27.05.2016 17:00 - 18:00 | 0 | 0 | 0 | 0 |
| 27.05.2016 18:00 - 19:00 | 0 | 0 | 0 | 0 |
| 27.05.2016 19:00 - 20:00 | 0 | 0 | 0 | 0 |
| 27.05.2016 20:00 - 21:00 | 0 | 0 | 0 | 0 |
| 27.05.2016 21:00 - 22:00 | 0 | 0 | 0 | 0 |
| 27.05.2016 22:00 - 23:00 | 0 | -800 | 0 | 0 |
| 27.05.2016 23:00 - 24:00 | 0 | -800 | 0 | 0 |
| 28.05.2016 00:00 - 01:00 | 0 | -800 | 0 | 0 |
| 28.05.2016 01:00 - 02:00 | 0 | -800 | 0 | 0 |
| 28.05.2016 02:00 - 03:00 | 0 | -800 | 0 | 0 |
| 28.05.2016 03:00 - 04:00 | 0 | -800 | 0 | 0 |
| 28.05.2016 04:00 - 05:00 | 0 | -800 | 0 | 0 |
| 28.05.2016 05:00 - 06:00 | 0 | -800 | 0 | 0 |
| 28.05.2016 06:00 - 07:00 | 0 | 0 | 0 | 0 |
| 28.05.2016 07:00 - 08:00 | 0 | 0 | 0 | 0 |
| 28.05.2016 08:00 - 09:00 | 0 | 0 | 0 | 0 |
| 28.05.2016 09:00 - 10:00 | 0 | 0 | 0 | 0 |
| 28.05.2016 10:00 - 11:00 | 0 | 0 | 0 | 0 |
| 28.05.2016 11:00 - 12:00 | 0 | 0 | 0 | 0 |
| 28.05.2016 12:00 - 13:00 | 0 | 0 | 0 | 0 |
| 28.05.2016 13:00 - 14:00 | 0 | 0 | 0 | 0 |
| 28.05.2016 14:00 - 15:00 | 0 | 0 | 0 | 0 |
| 28.05.2016 15:00 - 16:00 | 0 | 0 | 0 | 0 |
| 28.05.2016 16:00 - 17:00 | 0 | 0 | 0 | 0 |
| 28.05.2016 17:00 - 18:00 | 0 | 0 | 0 | 0 |
| 28.05.2016 18:00 - 19:00 | 0 | 0 | 0 | 0 |
| 28.05.2016 19:00 - 20:00 | 0 | 0 | 0 | 0 |
| 28.05.2016 20:00 - 21:00 | 0 | 0 | 0 | 0 |
| 28.05.2016 21:00 - 22:00 | 0 | 0 | 0 | 0 |
| 28.05.2016 22:00 - 23:00 | 0 | 0 | 0 | 0 |
| 28.05.2016 23:00 - 24:00 | 0 | 0 | 0 | 0 |
| 29.05.2016 00:00 - 01:00 | 0 | 0 | 0 | 0 |
| 29.05.2016 01:00 - 02:00 | 0 | 0 | 0 | 0 |
| 29.05.2016 02:00 - 03:00 | 0 | 0 | 0 | 0 |
| 29.05.2016 03:00 - 04:00 | 0 | 0 | 0 | 0 |
| 29.05.2016 04:00 - 05:00 | 0 | 0 | 0 | 0 |
| 29.05.2016 05:00 - 06:00 | 0 | 0 | 0 | 0 |
| 29.05.2016 06:00 - 07:00 | 0 | 0 | 0 | 0 |
| 29.05.2016 07:00 - 08:00 | 0 | 0 | 0 | 0 |
| 29.05.2016 08:00 - 09:00 | 0 | 0 | 0 | 0 |
| 29.05.2016 09:00 - 10:00 | 0 | 0 | 0 | 0 |
| 29.05.2016 10:00 - 11:00 | 0 | 0 | 0 | 0 |
| 29.05.2016 11:00 - 12:00 | 0 | 0 | 0 | 0 |
| 29.05.2016 12:00 - 13:00 | 0 | 0 | 0 | 0 |
| 29.05.2016 13:00 - 14:00 | 0 | 0 | 0 | 0 |
| 29.05.2016 14:00 - 15:00 | 0 | 0 | 0 | 0 |
| 29.05.2016 15:00 - 16:00 | 0 | 0 | 0 | 0 |
| 29.05.2016 16:00 - 17:00 | 0 | 0 | 0 | 0 |
| 29.05.2016 17:00 - 18:00 | 0 | 0 | 0 | 0 |
| 29.05.2016 18:00 - 19:00 | 0 | 0 | 0 | 0 |
| 29.05.2016 19:00 - 20:00 | 0 | 0 | 0 | 0 |
| 29.05.2016 20:00 - 21:00 | 0 | 0 | 0 | 0 |
| 29.05.2016 21:00 - 22:00 | 0 | 0 | 0 | 0 |
| 29.05.2016 22:00 - 23:00 | 0 | 0 | 0 | 0 |
| 29.05.2016 23:00 - 24:00 | 0 | 0 | 0 | 0 |
| 30.05.2016 00:00 - 01:00 | 0 | 0 | 0 | 0 |
| 30.05.2016 01:00 - 02:00 | 0 | 0 | 0 | 0 |
| 30.05.2016 02:00 - 03:00 | 0 | 0 | 0 | 0 |
| 30.05.2016 03:00 - 04:00 | 0 | 0 | 0 | 0 |
| 30.05.2016 04:00 - 05:00 | 0 | 0 | 0 | 0 |
| 30.05.2016 05:00 - 06:00 | 0 | 0 | 0 | 0 |
| 30.05.2016 06:00 - 07:00 | 0 | 0 | 0 | 0 |
| 30.05.2016 07:00 - 08:00 | 0 | 0 | 0 | 0 |
| 30.05.2016 08:00 - 09:00 | 0 | 0 | 0 | 0 |
| 30.05.2016 09:00 - 10:00 | 0 | 0 | 0 | 0 |
| 30.05.2016 10:00 - 11:00 | 0 | 0 | 0 | 0 |
| 30.05.2016 11:00 - 12:00 | 0 | 0 | 0 | 0 |
| 30.05.2016 12:00 - 13:00 | 0 | 0 | 0 | 0 |
| 30.05.2016 13:00 - 14:00 | 0 | 0 | 0 | 0 |
| 30.05.2016 14:00 - 15:00 | 0 | 0 | 0 | 0 |
| 30.05.2016 15:00 - 16:00 | 0 | 0 | 0 | 0 |
| 30.05.2016 16:00 - 17:00 | 0 | 0 | 0 | 0 |
| 30.05.2016 17:00 - 18:00 | 0 | 0 | 0 | 0 |
| 30.05.2016 18:00 - 19:00 | 0 | 0 | 0 | 0 |
| 30.05.2016 19:00 - 20:00 | 0 | 0 | 0 | 0 |
| 30.05.2016 20:00 - 21:00 | 0 | 0 | 0 | 0 |
| 30.05.2016 21:00 - 22:00 | 0 | 0 | 0 | 0 |
| 30.05.2016 22:00 - 23:00 | 0 | 0 | 0 | 0 |
| 30.05.2016 23:00 - 24:00 | 0 | 0 | 0 | 0 |
| 31.05.2016 00:00 - 01:00 | 0 | 0 | 0 | 0 |
| 31.05.2016 01:00 - 02:00 | 0 | 0 | 0 | 0 |
| 31.05.2016 02:00 - 03:00 | 0 | 0 | 0 | 0 |
| 31.05.2016 03:00 - 04:00 | 0 | 0 | 0 | 0 |
| 31.05.2016 04:00 - 05:00 | 0 | 0 | 0 | 0 |
| 31.05.2016 05:00 - 06:00 | 0 | 0 | 0 | 0 |
| 31.05.2016 06:00 - 07:00 | 0 | 0 | 0 | 0 |
| 31.05.2016 07:00 - 08:00 | 0 | 0 | 0 | 0 |
| 31.05.2016 08:00 - 09:00 | 0 | 0 | 0 | 0 |
| 31.05.2016 09:00 - 10:00 | 0 | 0 | 0 | 0 |
| 31.05.2016 10:00 - 11:00 | 0 | 0 | 0 | 0 |
| 31.05.2016 11:00 - 12:00 | 0 | 0 | 0 | 0 |
| 31.05.2016 12:00 - 13:00 | 0 | 0 | 0 | 0 |
| 31.05.2016 13:00 - 14:00 | 0 | 0 | 0 | 0 |
| 31.05.2016 14:00 - 15:00 | 0 | 0 | 0 | 0 |
| 31.05.2016 15:00 - 16:00 | 0 | 0 | 0 | 0 |
| 31.05.2016 16:00 - 17:00 | 0 | 0 | 0 | 0 |
| 31.05.2016 17:00 - 18:00 | 0 | 0 | 0 | 0 |
| 31.05.2016 18:00 - 19:00 | 0 | 0 | 0 | 0 |
| 31.05.2016 19:00 - 20:00 | 0 | 0 | 0 | 0 |
| 31.05.2016 20:00 - 21:00 | 0 | 0 | 0 | 0 |
| 31.05.2016 21:00 - 22:00 | 0 | 0 | 0 | 0 |
| 31.05.2016 22:00 - 23:00 | 0 | 0 | 0 | 0 |
| 31.05.2016 23:00 - 24:00 | 0 | 0 | 0 | 0 |
| 01.06.2016 00:00 - 01:00 | 0 | 0 | 0 | 0 |
| 01.06.2016 01:00 - 02:00 | 0 | 0 | 0 | 0 |
| 01.06.2016 02:00 - 03:00 | 0 | 0 | 0 | 0 |
| 01.06.2016 03:00 - 04:00 | 0 | 0 | 0 | 0 |
| 01.06.2016 04:00 - 05:00 | 0 | 0 | 0 | 0 |
| 01.06.2016 05:00 - 06:00 | 0 | 0 | 0 | 0 |